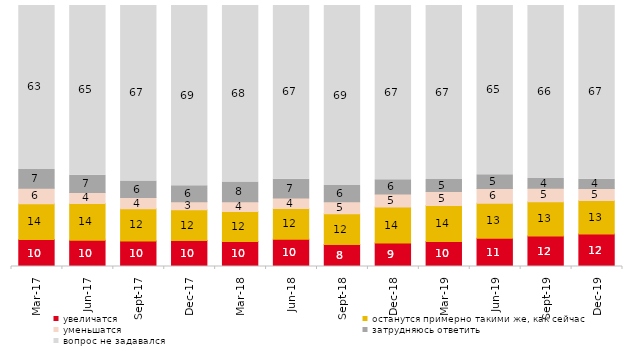
| Category | увеличатся | останутся примерно такими же, как сейчас | уменьшатся | затрудняюсь ответить | вопрос не задавался |
|---|---|---|---|---|---|
| 2017-03-01 | 10.3 | 13.75 | 5.95 | 7.2 | 62.8 |
| 2017-06-01 | 10.05 | 14.05 | 4.3 | 6.55 | 65.05 |
| 2017-09-01 | 9.8 | 12.3 | 4.3 | 6.4 | 67.2 |
| 2017-12-01 | 9.95 | 11.75 | 3.1 | 6.15 | 69.05 |
| 2018-03-01 | 9.6 | 11.5 | 3.75 | 7.5 | 67.65 |
| 2018-06-01 | 10.45 | 11.75 | 4.05 | 7.2 | 66.55 |
| 2018-09-01 | 8.45 | 11.8 | 4.6 | 6.15 | 69 |
| 2018-12-01 | 9.05 | 13.7 | 5 | 5.5 | 66.75 |
| 2019-03-01 | 9.597 | 13.774 | 5.321 | 4.625 | 66.683 |
| 2019-06-01 | 10.823 | 13.367 | 5.736 | 5.237 | 64.838 |
| 2019-09-01 | 11.683 | 13.119 | 5.198 | 3.713 | 66.287 |
| 2019-12-01 | 12.426 | 12.871 | 4.554 | 3.564 | 66.584 |